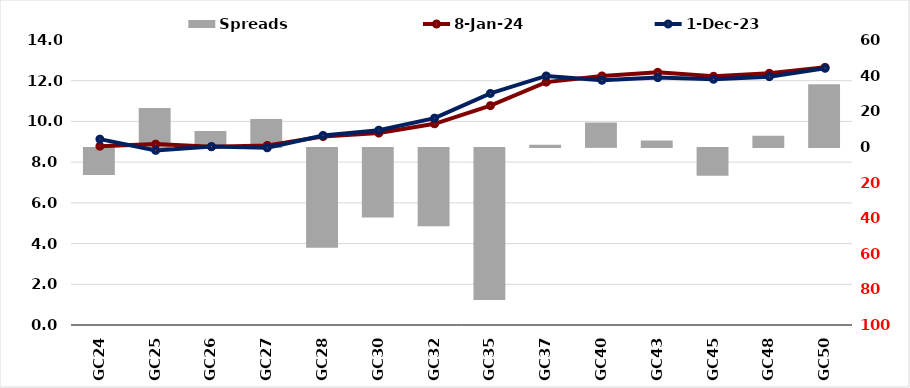
| Category |  Spreads   |
|---|---|
| GC24 | -15.215 |
| GC25 | 21.87 |
| GC26 | 8.872 |
| GC27 | 15.621 |
| GC28 | -56.067 |
| GC30 | -39.068 |
| GC32 | -43.945 |
| GC35 | -85.409 |
| GC37 | 1.138 |
| GC40 | 13.668 |
| GC43 | 3.61 |
| GC45 | -15.645 |
| GC48 | 6.185 |
| GC50 | 35.178 |